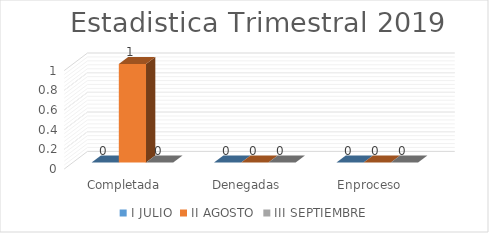
| Category | I JULIO | II AGOSTO | III SEPTIEMBRE |
|---|---|---|---|
| Completada | 0 | 1 | 0 |
| Denegadas | 0 | 0 | 0 |
| Enproceso | 0 | 0 | 0 |